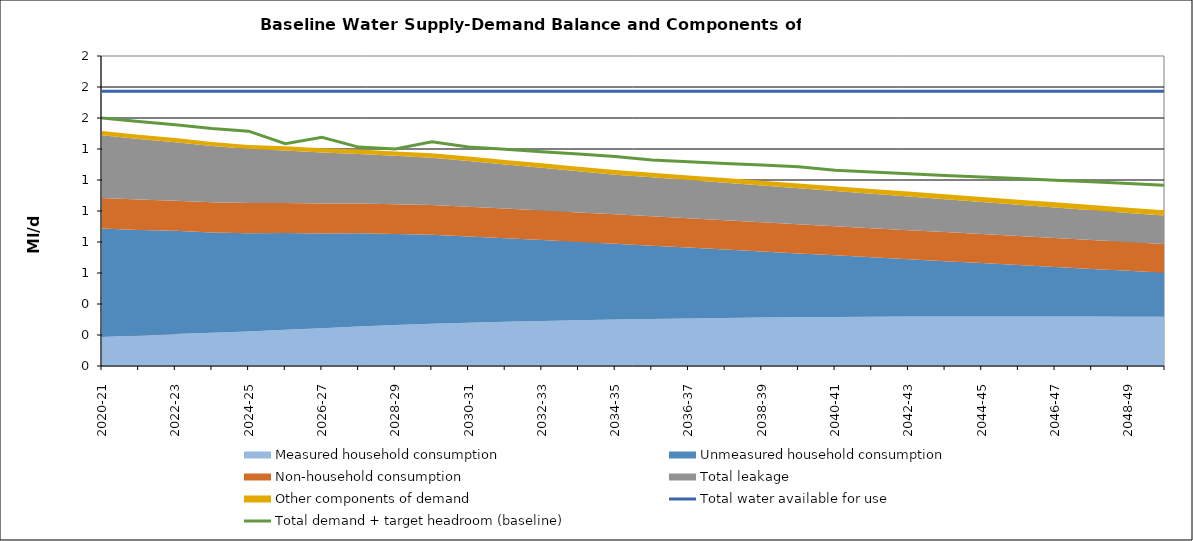
| Category | Total water available for use | Total demand + target headroom (baseline) |
|---|---|---|
| 2020-21 | 1.772 | 1.601 |
| 2021-22 | 1.772 | 1.578 |
| 2022-23 | 1.772 | 1.557 |
| 2023-24 | 1.772 | 1.532 |
| 2024-25 | 1.772 | 1.515 |
| 2025-26 | 1.772 | 1.434 |
| 2026-27 | 1.772 | 1.476 |
| 2027-28 | 1.772 | 1.412 |
| 2028-29 | 1.772 | 1.401 |
| 2029-30 | 1.772 | 1.446 |
| 2030-31 | 1.772 | 1.413 |
| 2031-32 | 1.772 | 1.398 |
| 2032-33 | 1.772 | 1.383 |
| 2033-34 | 1.772 | 1.367 |
| 2034-35 | 1.772 | 1.352 |
| 2035-36 | 1.772 | 1.329 |
| 2036-37 | 1.772 | 1.317 |
| 2037-38 | 1.772 | 1.307 |
| 2038-39 | 1.772 | 1.297 |
| 2039-40 | 1.772 | 1.286 |
| 2040-41 | 1.772 | 1.262 |
| 2041-42 | 1.772 | 1.251 |
| 2042-43 | 1.772 | 1.241 |
| 2043-44 | 1.772 | 1.23 |
| 2044-45 | 1.772 | 1.22 |
| 2045-46 | 1.772 | 1.209 |
| 2046-47 | 1.772 | 1.198 |
| 2047-48 | 1.772 | 1.189 |
| 2048-49 | 1.772 | 1.178 |
| 2049-50 | 1.772 | 1.166 |